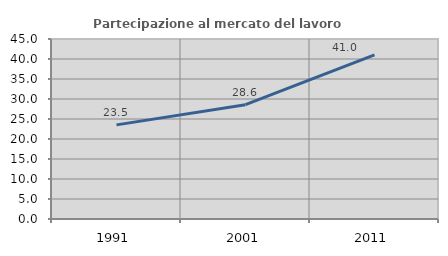
| Category | Partecipazione al mercato del lavoro  femminile |
|---|---|
| 1991.0 | 23.529 |
| 2001.0 | 28.571 |
| 2011.0 | 41.038 |